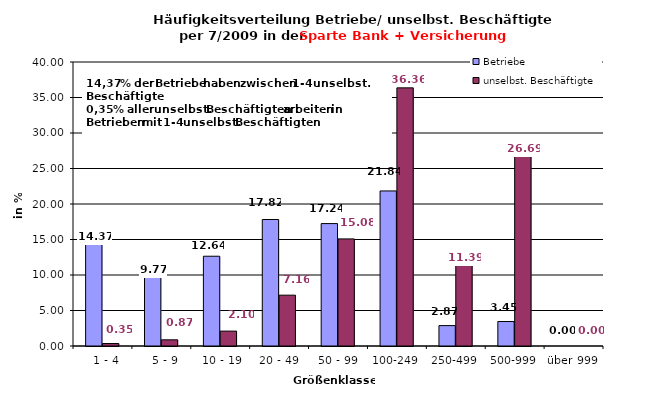
| Category | Betriebe | unselbst. Beschäftigte |
|---|---|---|
|   1 - 4 | 14.368 | 0.347 |
|   5 - 9 | 9.77 | 0.871 |
|  10 - 19 | 12.644 | 2.096 |
| 20 - 49 | 17.816 | 7.16 |
| 50 - 99 | 17.241 | 15.084 |
| 100-249 | 21.839 | 36.357 |
| 250-499 | 2.874 | 11.394 |
| 500-999 | 3.448 | 26.691 |
| über 999 | 0 | 0 |